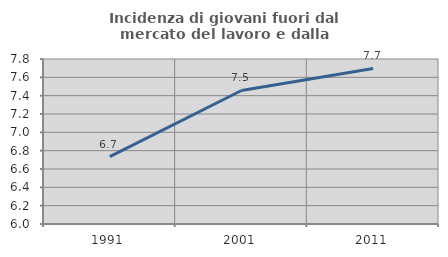
| Category | Incidenza di giovani fuori dal mercato del lavoro e dalla formazione  |
|---|---|
| 1991.0 | 6.734 |
| 2001.0 | 7.457 |
| 2011.0 | 7.697 |